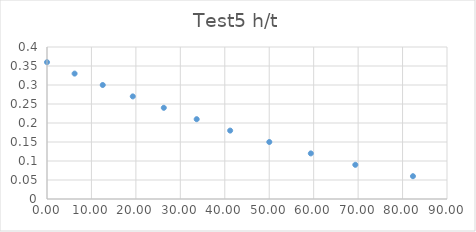
| Category | Series 0 |
|---|---|
| 0.0 | 0.36 |
| 6.21 | 0.33 |
| 12.54 | 0.3 |
| 19.3 | 0.27 |
| 26.28 | 0.24 |
| 33.68 | 0.21 |
| 41.21 | 0.18 |
| 50.02 | 0.15 |
| 59.36 | 0.12 |
| 69.37 | 0.09 |
| 82.34 | 0.06 |